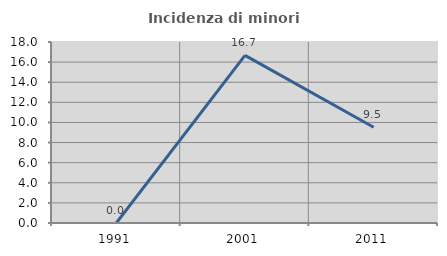
| Category | Incidenza di minori stranieri |
|---|---|
| 1991.0 | 0 |
| 2001.0 | 16.667 |
| 2011.0 | 9.524 |